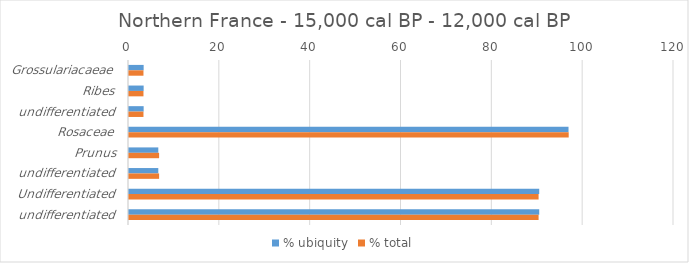
| Category | % ubiquity | % total |
|---|---|---|
| Grossulariacaeae | 3.226 | 3.185 |
| Ribes | 3.226 | 3.185 |
| undifferentiated | 3.226 | 3.185 |
| Rosaceae | 96.774 | 96.815 |
| Prunus | 6.452 | 6.63 |
| undifferentiated | 6.452 | 6.63 |
| Undifferentiated | 90.323 | 90.184 |
| undifferentiated | 90.323 | 90.184 |